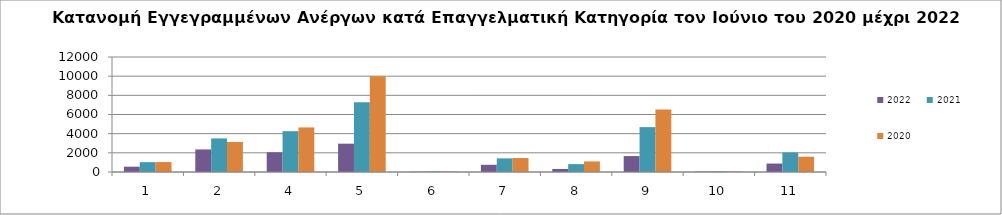
| Category | 2022 | 2021 | 2020 |
|---|---|---|---|
| 1.0 | 554 | 1027 | 1033 |
| 2.0 | 2353 | 3505 | 3138 |
| 4.0 | 2059 | 4260 | 4651 |
| 5.0 | 2955 | 7274 | 9981 |
| 6.0 | 23 | 64 | 57 |
| 7.0 | 751 | 1422 | 1463 |
| 8.0 | 318 | 823 | 1104 |
| 9.0 | 1663 | 4682 | 6510 |
| 10.0 | 36 | 72 | 56 |
| 11.0 | 881 | 2034 | 1594 |